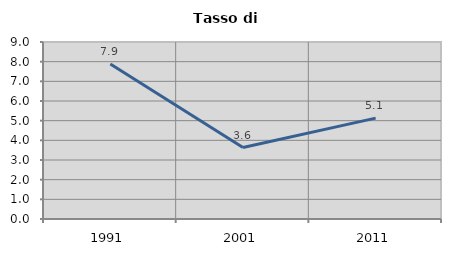
| Category | Tasso di disoccupazione   |
|---|---|
| 1991.0 | 7.877 |
| 2001.0 | 3.633 |
| 2011.0 | 5.128 |